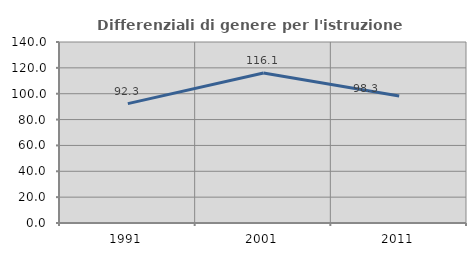
| Category | Differenziali di genere per l'istruzione superiore |
|---|---|
| 1991.0 | 92.338 |
| 2001.0 | 116.088 |
| 2011.0 | 98.253 |